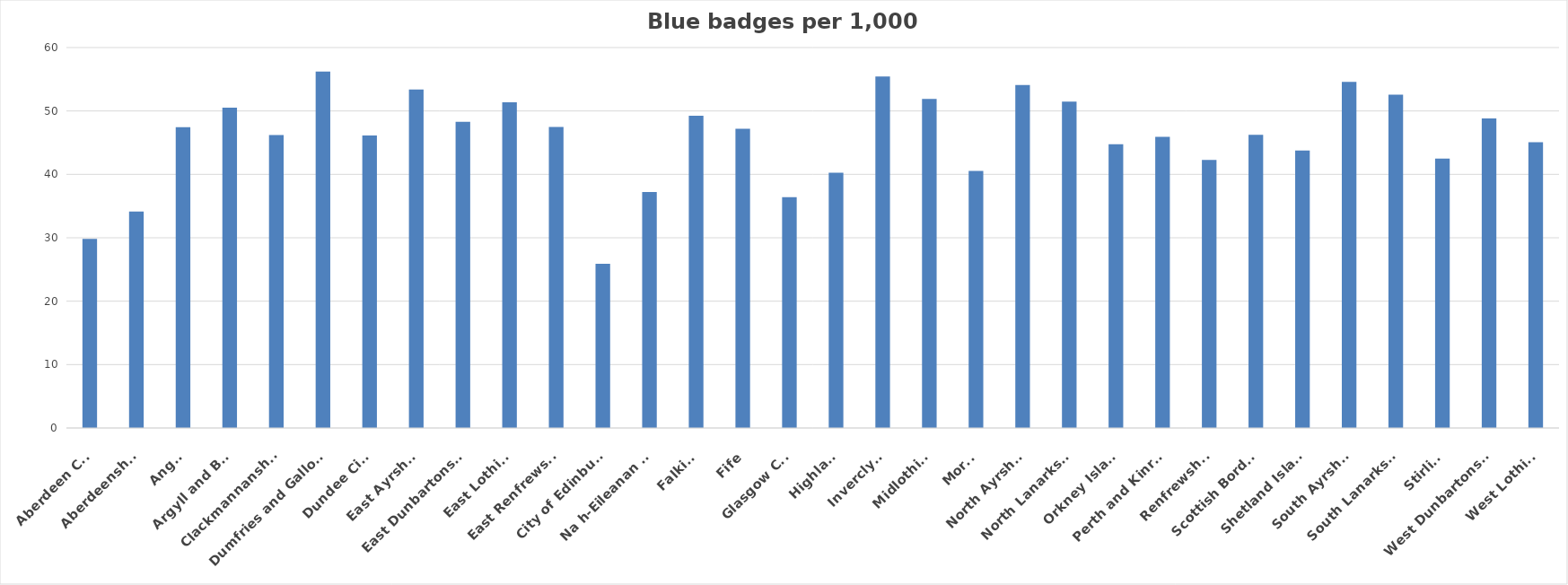
| Category | Series 0 |
|---|---|
| Aberdeen City | 29.825 |
| Aberdeenshire | 34.151 |
| Angus | 47.451 |
| Argyll and Bute | 50.51 |
| Clackmannanshire | 46.217 |
| Dumfries and Galloway | 56.2 |
| Dundee City | 46.128 |
| East Ayrshire | 53.368 |
| East Dunbartonshire | 48.274 |
| East Lothian | 51.378 |
| East Renfrewshire | 47.474 |
| City of Edinburgh | 25.908 |
| Na h-Eileanan Siar | 37.2 |
| Falkirk | 49.235 |
| Fife | 47.21 |
| Glasgow City | 36.394 |
| Highland | 40.267 |
| Inverclyde | 55.45 |
| Midlothian | 51.912 |
| Moray | 40.525 |
| North Ayrshire | 54.098 |
| North Lanarkshire | 51.476 |
| Orkney Islands | 44.765 |
| Perth and Kinross | 45.933 |
| Renfrewshire | 42.281 |
| Scottish Borders | 46.225 |
| Shetland Islands | 43.766 |
| South Ayrshire | 54.593 |
| South Lanarkshire | 52.574 |
| Stirling | 42.506 |
| West Dunbartonshire | 48.81 |
| West Lothian | 45.064 |